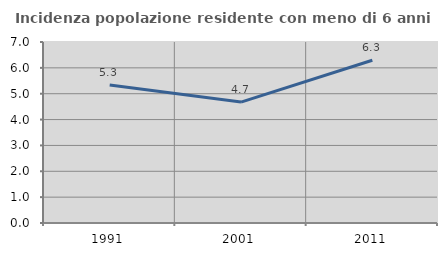
| Category | Incidenza popolazione residente con meno di 6 anni |
|---|---|
| 1991.0 | 5.34 |
| 2001.0 | 4.677 |
| 2011.0 | 6.295 |